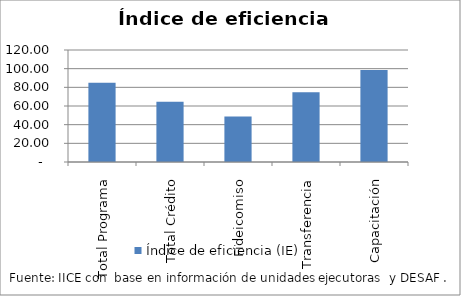
| Category | Índice de eficiencia (IE)  |
|---|---|
| Total Programa | 84.862 |
| Total Crédito | 64.588 |
| Fideicomiso | 48.812 |
| Transferencia | 74.605 |
| Capacitación | 98.448 |